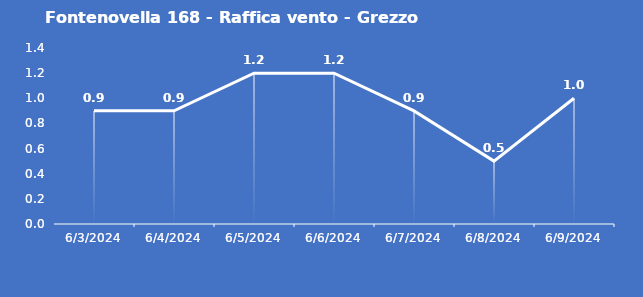
| Category | Fontenovella 168 - Raffica vento - Grezzo (m/s) |
|---|---|
| 6/3/24 | 0.9 |
| 6/4/24 | 0.9 |
| 6/5/24 | 1.2 |
| 6/6/24 | 1.2 |
| 6/7/24 | 0.9 |
| 6/8/24 | 0.5 |
| 6/9/24 | 1 |